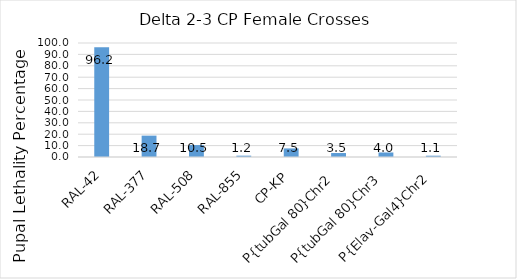
| Category | pupal lethality percentage |
|---|---|
| RAL-42 | 96.21 |
| RAL-377 | 18.737 |
| RAL-508 | 10.476 |
| RAL-855 | 1.171 |
| CP-KP | 7.524 |
| P{tubGal 80}Chr2 | 3.483 |
| P{tubGal 80}Chr3 | 3.96 |
| P{Elav-Gal4}Chr2 | 1.143 |